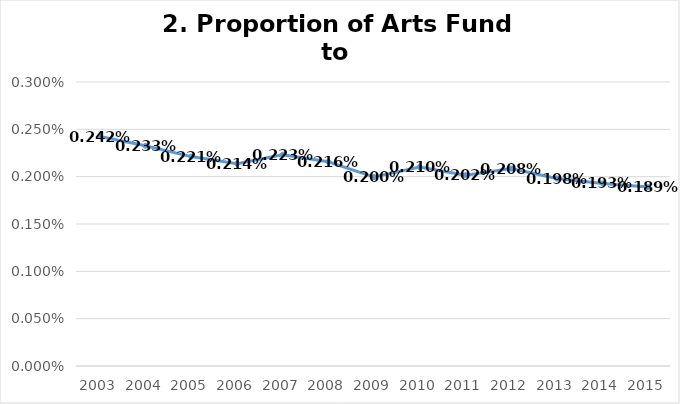
| Category | Ratio of Arts Fund to Total Government Revenue |
|---|---|
| 2003.0 | 0.002 |
| 2004.0 | 0.002 |
| 2005.0 | 0.002 |
| 2006.0 | 0.002 |
| 2007.0 | 0.002 |
| 2008.0 | 0.002 |
| 2009.0 | 0.002 |
| 2010.0 | 0.002 |
| 2011.0 | 0.002 |
| 2012.0 | 0.002 |
| 2013.0 | 0.002 |
| 2014.0 | 0.002 |
| 2015.0 | 0.002 |